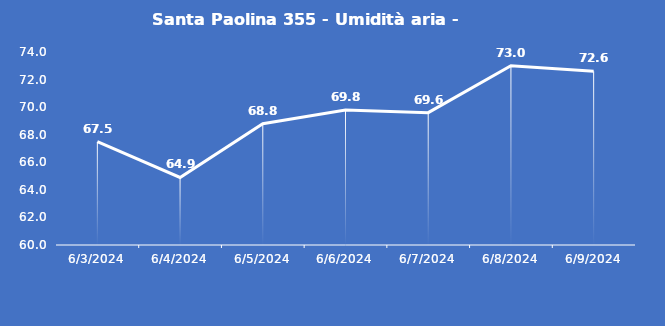
| Category | Santa Paolina 355 - Umidità aria - Grezzo (%) |
|---|---|
| 6/3/24 | 67.5 |
| 6/4/24 | 64.9 |
| 6/5/24 | 68.8 |
| 6/6/24 | 69.8 |
| 6/7/24 | 69.6 |
| 6/8/24 | 73 |
| 6/9/24 | 72.6 |